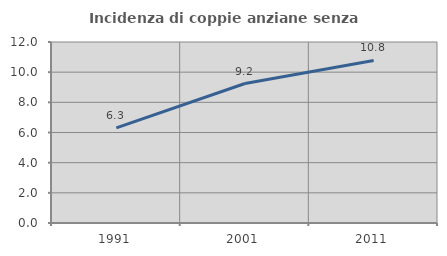
| Category | Incidenza di coppie anziane senza figli  |
|---|---|
| 1991.0 | 6.306 |
| 2001.0 | 9.249 |
| 2011.0 | 10.774 |